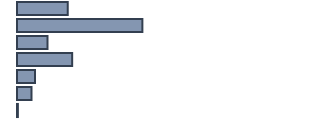
| Category | Series 0 |
|---|---|
| 0 | 17.2 |
| 1 | 42.5 |
| 2 | 10.3 |
| 3 | 18.7 |
| 4 | 6.1 |
| 5 | 4.9 |
| 6 | 0.3 |